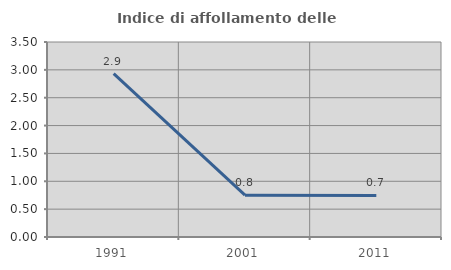
| Category | Indice di affollamento delle abitazioni  |
|---|---|
| 1991.0 | 2.934 |
| 2001.0 | 0.752 |
| 2011.0 | 0.747 |